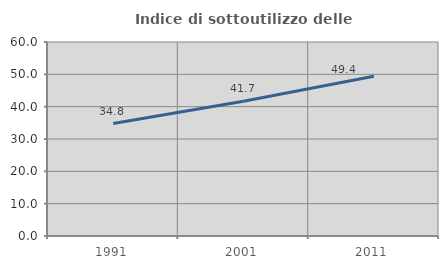
| Category | Indice di sottoutilizzo delle abitazioni  |
|---|---|
| 1991.0 | 34.773 |
| 2001.0 | 41.692 |
| 2011.0 | 49.416 |